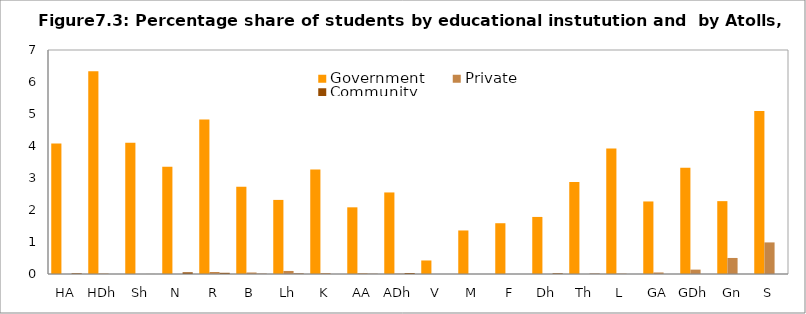
| Category | Government | Private | Community |
|---|---|---|---|
| HA | 4.078 | 0 | 0.022 |
| HDh | 6.339 | 0.014 | 0 |
| Sh | 4.1 | 0 | 0.001 |
| N | 3.353 | 0 | 0.053 |
| R | 4.832 | 0.062 | 0.038 |
| B | 2.728 | 0.046 | 0.009 |
| Lh | 2.315 | 0.095 | 0.017 |
| K | 3.265 | 0.029 | 0 |
| AA | 2.084 | 0.023 | 0.007 |
| ADh | 2.548 | 0.011 | 0.032 |
| V | 0.423 | 0 | 0 |
| M | 1.36 | 0 | 0 |
| F | 1.587 | 0 | 0 |
| Dh | 1.783 | 0 | 0.022 |
| Th | 2.875 | 0 | 0.011 |
| L | 3.919 | 0.011 | 0 |
| GA | 2.267 | 0.047 | 0 |
| GDh | 3.321 | 0.137 | 0 |
| Gn | 2.277 | 0.501 | 0 |
| S | 5.096 | 0.987 | 0 |